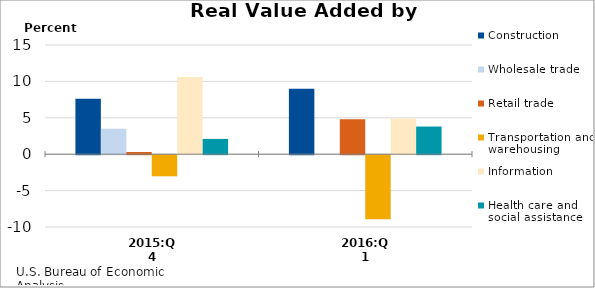
| Category | Construction | Wholesale trade | Retail trade | Transportation and warehousing | Information | Health care and social assistance |
|---|---|---|---|---|---|---|
| 2015:Q4 | 7.6 | 3.5 | 0.3 | -2.9 | 10.6 | 2.1 |
| 2016:Q1 | 9 | 0 | 4.8 | -8.8 | 4.9 | 3.8 |